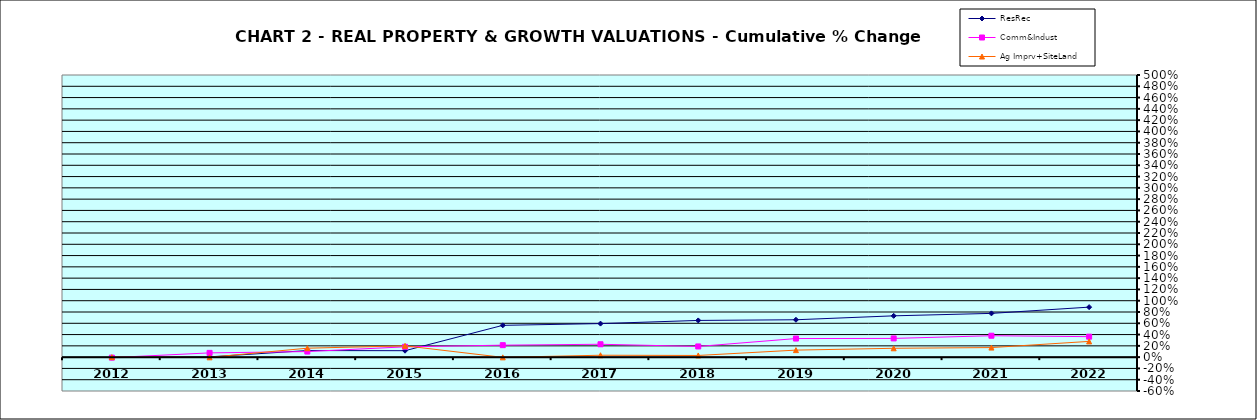
| Category | ResRec | Comm&Indust | Ag Imprv+SiteLand |
|---|---|---|---|
| 2012.0 | -0.008 | -0.008 | 0 |
| 2013.0 | 0.005 | 0.075 | -0.003 |
| 2014.0 | 0.117 | 0.099 | 0.159 |
| 2015.0 | 0.114 | 0.183 | 0.201 |
| 2016.0 | 0.564 | 0.212 | -0.004 |
| 2017.0 | 0.594 | 0.228 | 0.034 |
| 2018.0 | 0.651 | 0.19 | 0.03 |
| 2019.0 | 0.662 | 0.329 | 0.125 |
| 2020.0 | 0.732 | 0.332 | 0.157 |
| 2021.0 | 0.775 | 0.379 | 0.17 |
| 2022.0 | 0.886 | 0.363 | 0.279 |